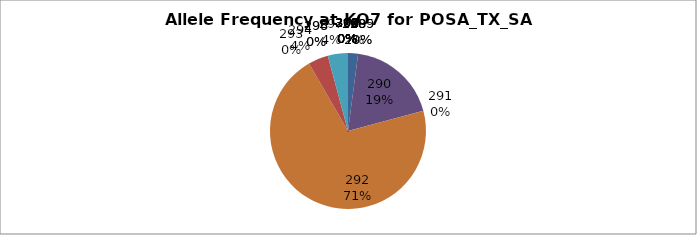
| Category | Series 0 |
|---|---|
| 260.0 | 0.021 |
| 285.0 | 0 |
| 289.0 | 0 |
| 290.0 | 0.188 |
| 291.0 | 0 |
| 292.0 | 0.708 |
| 293.0 | 0 |
| 294.0 | 0.042 |
| 295.0 | 0 |
| 296.0 | 0 |
| 297.0 | 0.042 |
| 298.0 | 0 |
| 299.0 | 0 |
| 300.0 | 0 |
| 301.0 | 0 |
| 302.0 | 0 |
| 304.0 | 0 |
| 305.0 | 0 |
| 306.0 | 0 |